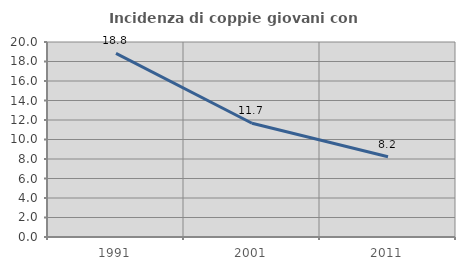
| Category | Incidenza di coppie giovani con figli |
|---|---|
| 1991.0 | 18.839 |
| 2001.0 | 11.665 |
| 2011.0 | 8.228 |